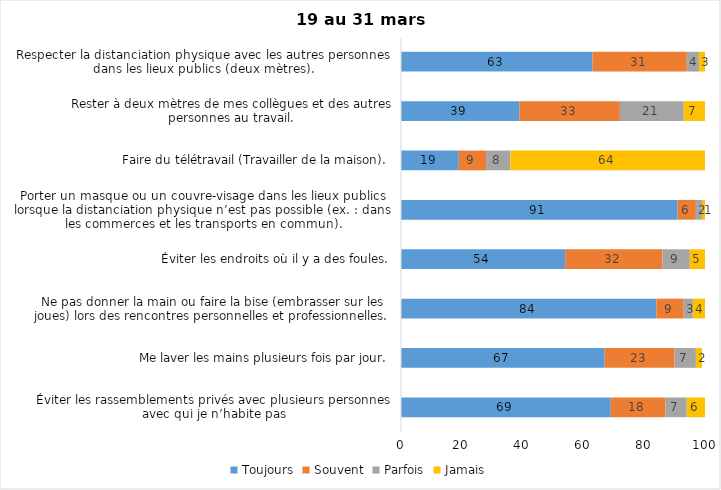
| Category | Toujours | Souvent | Parfois | Jamais |
|---|---|---|---|---|
| Éviter les rassemblements privés avec plusieurs personnes avec qui je n’habite pas | 69 | 18 | 7 | 6 |
| Me laver les mains plusieurs fois par jour. | 67 | 23 | 7 | 2 |
| Ne pas donner la main ou faire la bise (embrasser sur les joues) lors des rencontres personnelles et professionnelles. | 84 | 9 | 3 | 4 |
| Éviter les endroits où il y a des foules. | 54 | 32 | 9 | 5 |
| Porter un masque ou un couvre-visage dans les lieux publics lorsque la distanciation physique n’est pas possible (ex. : dans les commerces et les transports en commun). | 91 | 6 | 2 | 1 |
| Faire du télétravail (Travailler de la maison). | 19 | 9 | 8 | 64 |
| Rester à deux mètres de mes collègues et des autres personnes au travail. | 39 | 33 | 21 | 7 |
| Respecter la distanciation physique avec les autres personnes dans les lieux publics (deux mètres). | 63 | 31 | 4 | 3 |